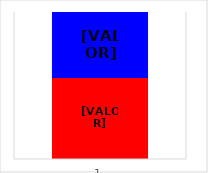
| Category | Series 2 | Series 1 | Series 0 |
|---|---|---|---|
| 0 |  | 1250500 | 990000 |